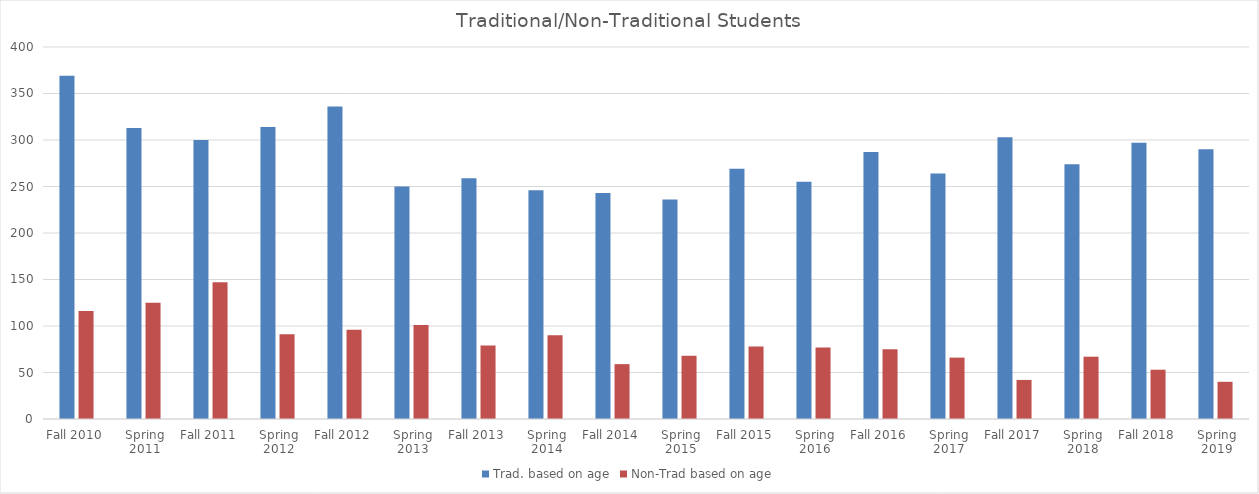
| Category | Trad. based on age | Non-Trad based on age |
|---|---|---|
| Fall 2010 | 369 | 116 |
| Spring 2011 | 313 | 125 |
| Fall 2011 | 300 | 147 |
| Spring 2012 | 314 | 91 |
| Fall 2012 | 336 | 96 |
| Spring 2013 | 250 | 101 |
| Fall 2013 | 259 | 79 |
| Spring 2014 | 246 | 90 |
| Fall 2014 | 243 | 59 |
| Spring 2015 | 236 | 68 |
| Fall 2015 | 269 | 78 |
| Spring 2016 | 255 | 77 |
| Fall 2016 | 287 | 75 |
| Spring 2017 | 264 | 66 |
| Fall 2017 | 303 | 42 |
| Spring 2018 | 274 | 67 |
| Fall 2018 | 297 | 53 |
| Spring 2019 | 290 | 40 |